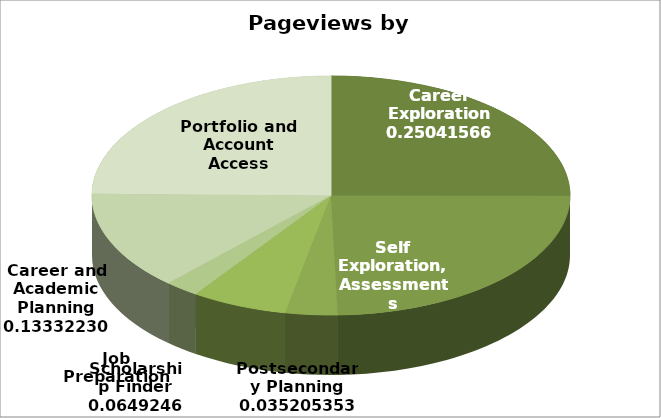
| Category | Series 0 |
|---|---|
| Career Exploration | 1806581 |
| Self Exploration, Assessments | 1768350 |
| Postsecondary Planning | 253983 |
| Scholarship Finder | 468388 |
| Job Preparation | 168915 |
| Career and Academic Planning | 961831 |
| Portfolio and Account Access | 1786281 |